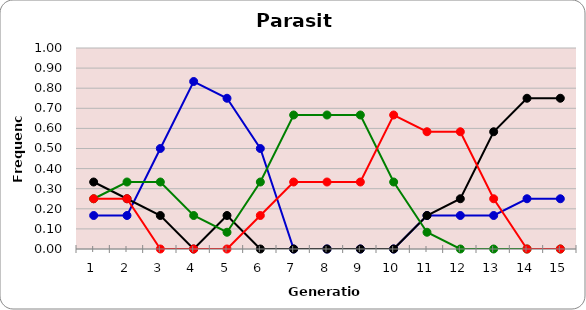
| Category | Sp | Cl | Di | He |
|---|---|---|---|---|
| 1.0 | 0.167 | 0.333 | 0.25 | 0.25 |
| 2.0 | 0.167 | 0.25 | 0.333 | 0.25 |
| 3.0 | 0.5 | 0.167 | 0.333 | 0 |
| 4.0 | 0.833 | 0 | 0.167 | 0 |
| 5.0 | 0.75 | 0.167 | 0.083 | 0 |
| 6.0 | 0.5 | 0 | 0.333 | 0.167 |
| 7.0 | 0 | 0 | 0.667 | 0.333 |
| 8.0 | 0 | 0 | 0.667 | 0.333 |
| 9.0 | 0 | 0 | 0.667 | 0.333 |
| 10.0 | 0 | 0 | 0.333 | 0.667 |
| 11.0 | 0.167 | 0.167 | 0.083 | 0.583 |
| 12.0 | 0.167 | 0.25 | 0 | 0.583 |
| 13.0 | 0.167 | 0.583 | 0 | 0.25 |
| 14.0 | 0.25 | 0.75 | 0 | 0 |
| 15.0 | 0.25 | 0.75 | 0 | 0 |